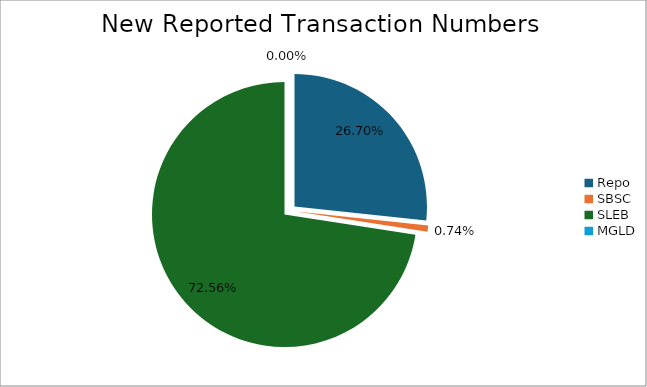
| Category | Series 0 |
|---|---|
| Repo | 305399 |
| SBSC | 8458 |
| SLEB | 830014 |
| MGLD | 26 |